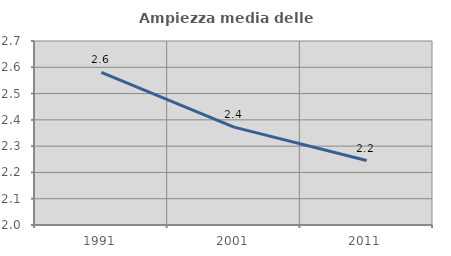
| Category | Ampiezza media delle famiglie |
|---|---|
| 1991.0 | 2.581 |
| 2001.0 | 2.372 |
| 2011.0 | 2.245 |